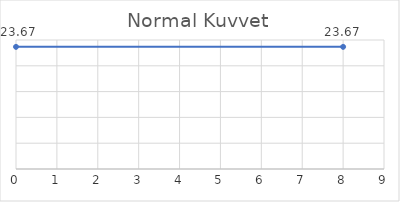
| Category | Series 0 |
|---|---|
| 0.0 | 23.672 |
| 8.0 | 23.672 |